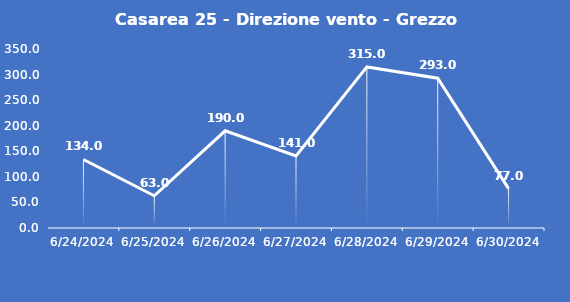
| Category | Casarea 25 - Direzione vento - Grezzo (°N) |
|---|---|
| 6/24/24 | 134 |
| 6/25/24 | 63 |
| 6/26/24 | 190 |
| 6/27/24 | 141 |
| 6/28/24 | 315 |
| 6/29/24 | 293 |
| 6/30/24 | 77 |